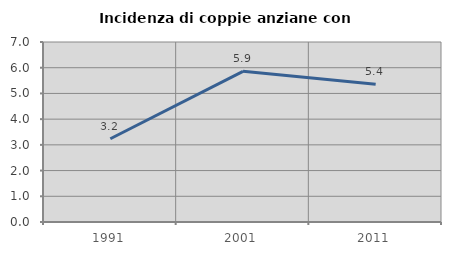
| Category | Incidenza di coppie anziane con figli |
|---|---|
| 1991.0 | 3.237 |
| 2001.0 | 5.859 |
| 2011.0 | 5.361 |